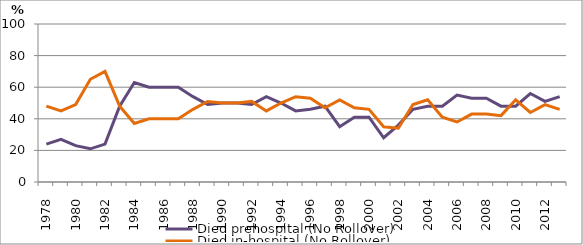
| Category | Died prehospital (No Rollover) | Died in-hospital (No Rollover) |
|---|---|---|
| 1978.0 | 24 | 48 |
| 1979.0 | 27 | 45 |
| 1980.0 | 23 | 49 |
| 1981.0 | 21 | 65 |
| 1982.0 | 24 | 70 |
| 1983.0 | 48 | 48 |
| 1984.0 | 63 | 37 |
| 1985.0 | 60 | 40 |
| 1986.0 | 60 | 40 |
| 1987.0 | 60 | 40 |
| 1988.0 | 54 | 46 |
| 1989.0 | 49 | 51 |
| 1990.0 | 50 | 50 |
| 1991.0 | 50 | 50 |
| 1992.0 | 49 | 51 |
| 1993.0 | 54 | 45 |
| 1994.0 | 50 | 50 |
| 1995.0 | 45 | 54 |
| 1996.0 | 46 | 53 |
| 1997.0 | 48 | 47 |
| 1998.0 | 35 | 52 |
| 1999.0 | 41 | 47 |
| 2000.0 | 41 | 46 |
| 2001.0 | 28 | 35 |
| 2002.0 | 36 | 34 |
| 2003.0 | 46 | 49 |
| 2004.0 | 48 | 52 |
| 2005.0 | 48 | 41 |
| 2006.0 | 55 | 38 |
| 2007.0 | 53 | 43 |
| 2008.0 | 53 | 43 |
| 2009.0 | 48 | 42 |
| 2010.0 | 48 | 52 |
| 2011.0 | 56 | 44 |
| 2012.0 | 51 | 49 |
| 2013.0 | 54 | 46 |